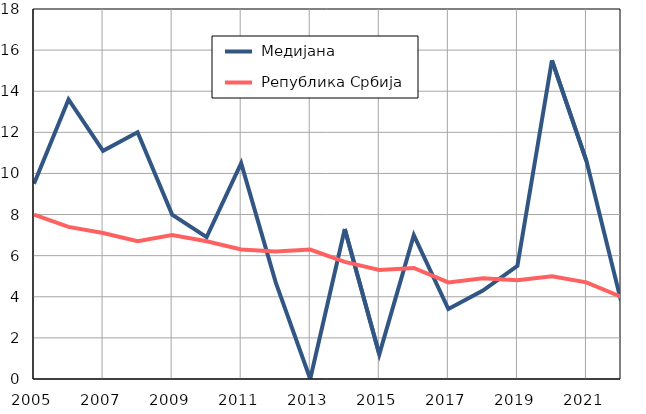
| Category |  Медијана |  Република Србија |
|---|---|---|
| 2005.0 | 9.5 | 8 |
| 2006.0 | 13.6 | 7.4 |
| 2007.0 | 11.1 | 7.1 |
| 2008.0 | 12 | 6.7 |
| 2009.0 | 8 | 7 |
| 2010.0 | 6.9 | 6.7 |
| 2011.0 | 10.5 | 6.3 |
| 2012.0 | 4.7 | 6.2 |
| 2013.0 | 0 | 6.3 |
| 2014.0 | 7.3 | 5.7 |
| 2015.0 | 1.2 | 5.3 |
| 2016.0 | 7 | 5.4 |
| 2017.0 | 3.4 | 4.7 |
| 2018.0 | 4.3 | 4.9 |
| 2019.0 | 5.5 | 4.8 |
| 2020.0 | 15.5 | 5 |
| 2021.0 | 10.6 | 4.7 |
| 2022.0 | 3.8 | 4 |